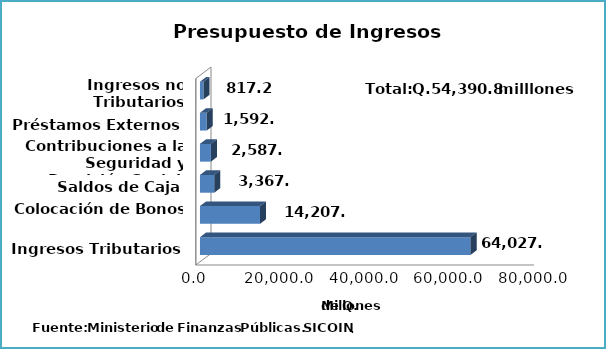
| Category | Series 0 |
|---|---|
| Ingresos Tributarios | 64027.7 |
| Colocación de Bonos | 14207.6 |
| Saldos de Caja | 3367.4 |
| Contribuciones a la Seguridad y Previsión Social  | 2587.2 |
| Préstamos Externos | 1592.6 |
| Ingresos no Tributarios | 817.2 |